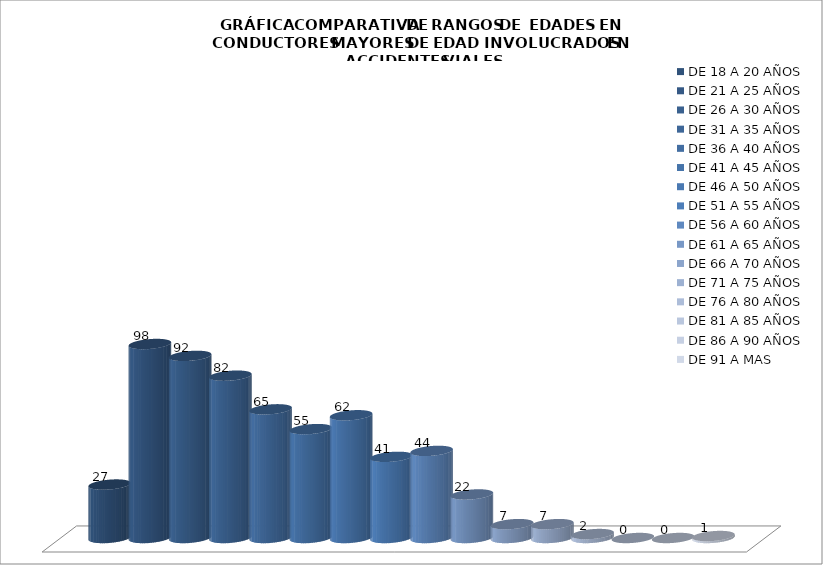
| Category | DE 18 A 20 AÑOS | DE 21 A 25 AÑOS | DE 26 A 30 AÑOS | DE 31 A 35 AÑOS | DE 36 A 40 AÑOS | DE 41 A 45 AÑOS | DE 46 A 50 AÑOS | DE 51 A 55 AÑOS | DE 56 A 60 AÑOS | DE 61 A 65 AÑOS | DE 66 A 70 AÑOS | DE 71 A 75 AÑOS | DE 76 A 80 AÑOS | DE 81 A 85 AÑOS | DE 86 A 90 AÑOS | DE 91 A MAS |
|---|---|---|---|---|---|---|---|---|---|---|---|---|---|---|---|---|
| 0 | 27 | 98 | 92 | 82 | 65 | 55 | 62 | 41 | 44 | 22 | 7 | 7 | 2 | 0 | 0 | 1 |